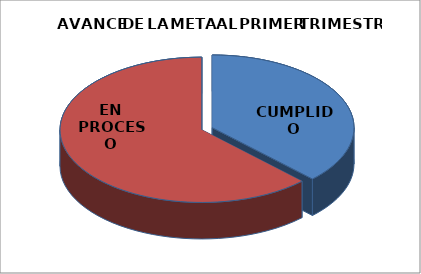
| Category | AVANCE TRIMESTRAL DE LA META |
|---|---|
| CUMPLIDO | 9 |
| EN PROCESO | 15 |